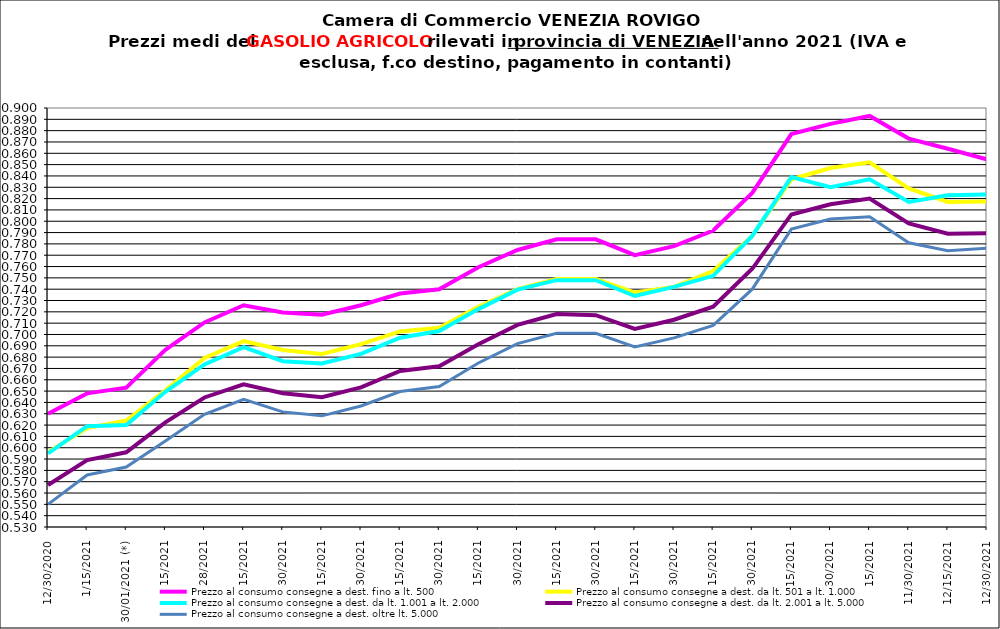
| Category | Prezzo al consumo consegne a dest. fino a lt. 500 | Prezzo al consumo consegne a dest. da lt. 501 a lt. 1.000 | Prezzo al consumo consegne a dest. da lt. 1.001 a lt. 2.000 | Prezzo al consumo consegne a dest. da lt. 2.001 a lt. 5.000 | Prezzo al consumo consegne a dest. oltre lt. 5.000 |
|---|---|---|---|---|---|
| 30/12/2020 | 0.63 | 0.596 | 0.595 | 0.567 | 0.55 |
| 15/01/2021 | 0.648 | 0.617 | 0.619 | 0.589 | 0.576 |
| 30/01/2021 (*) | 0.653 | 0.624 | 0.62 | 0.596 | 0.583 |
| 15/02/2021 | 0.686 | 0.651 | 0.649 | 0.622 | 0.606 |
| 28/02/2021 | 0.711 | 0.679 | 0.674 | 0.644 | 0.63 |
| 15/03/2021 | 0.726 | 0.694 | 0.689 | 0.656 | 0.643 |
| 30/03/2021 | 0.719 | 0.686 | 0.676 | 0.648 | 0.632 |
| 15/04/2021 | 0.717 | 0.683 | 0.674 | 0.645 | 0.628 |
| 30/04/2021 | 0.726 | 0.692 | 0.683 | 0.653 | 0.637 |
| 15/05/2021 | 0.736 | 0.703 | 0.697 | 0.668 | 0.65 |
| 30/05/2021 | 0.74 | 0.706 | 0.703 | 0.672 | 0.654 |
| 15/06/2021 | 0.759 | 0.724 | 0.722 | 0.691 | 0.675 |
| 30/06/2021 | 0.775 | 0.74 | 0.74 | 0.708 | 0.692 |
| 15/07/2021 | 0.784 | 0.749 | 0.748 | 0.718 | 0.701 |
| 30/07/2021 | 0.784 | 0.749 | 0.748 | 0.717 | 0.701 |
| 15/08/2021 | 0.77 | 0.737 | 0.734 | 0.705 | 0.689 |
| 30/08/2021 | 0.778 | 0.742 | 0.742 | 0.713 | 0.697 |
| 15/09/2021 | 0.792 | 0.756 | 0.752 | 0.724 | 0.708 |
| 30/09/2021 | 0.825 | 0.787 | 0.787 | 0.758 | 0.74 |
| 15/10/2021 | 0.877 | 0.837 | 0.839 | 0.806 | 0.793 |
| 30/10/2021 | 0.886 | 0.847 | 0.83 | 0.815 | 0.802 |
| 15/11/2021 | 0.893 | 0.852 | 0.837 | 0.82 | 0.804 |
| 30/11/2021 | 0.873 | 0.829 | 0.817 | 0.798 | 0.781 |
| 15/12/2021 | 0.864 | 0.817 | 0.823 | 0.789 | 0.774 |
| 30/12/2021 | 0.855 | 0.818 | 0.824 | 0.789 | 0.776 |